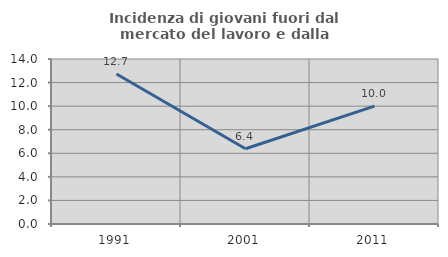
| Category | Incidenza di giovani fuori dal mercato del lavoro e dalla formazione  |
|---|---|
| 1991.0 | 12.727 |
| 2001.0 | 6.383 |
| 2011.0 | 10 |